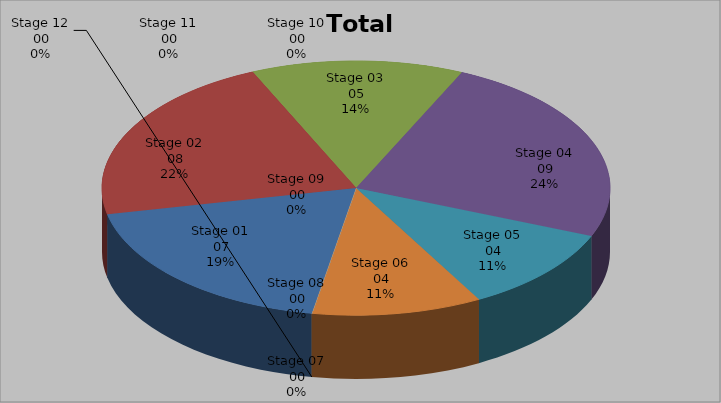
| Category | Series 0 |
|---|---|
| Stage 01 | 7 |
| Stage 02 | 8 |
| Stage 03 | 5 |
| Stage 04 | 9 |
| Stage 05 | 4 |
| Stage 06 | 4 |
| Stage 07 | 0 |
| Stage 08 | 0 |
| Stage 09 | 0 |
| Stage 10 | 0 |
| Stage 11 | 0 |
| Stage 12 | 0 |